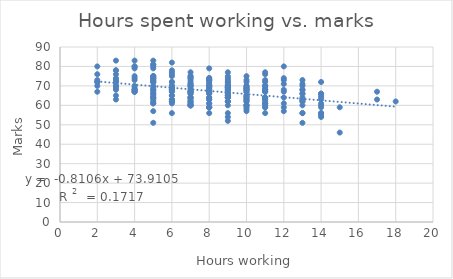
| Category | Mark |
|---|---|
| 9.0 | 64 |
| 4.0 | 74 |
| 13.0 | 73 |
| 9.0 | 65 |
| 8.0 | 72 |
| 8.0 | 63 |
| 7.0 | 66 |
| 7.0 | 60 |
| 9.0 | 69 |
| 9.0 | 73 |
| 8.0 | 73 |
| 7.0 | 71 |
| 9.0 | 60 |
| 10.0 | 73 |
| 14.0 | 61 |
| 2.0 | 72 |
| 6.0 | 72 |
| 8.0 | 74 |
| 9.0 | 56 |
| 14.0 | 72 |
| 17.0 | 67 |
| 9.0 | 69 |
| 11.0 | 56 |
| 10.0 | 69 |
| 11.0 | 61 |
| 3.0 | 74 |
| 13.0 | 63 |
| 7.0 | 60 |
| 14.0 | 63 |
| 10.0 | 64 |
| 11.0 | 64 |
| 5.0 | 73 |
| 3.0 | 63 |
| 11.0 | 72 |
| 10.0 | 67 |
| 5.0 | 64 |
| 11.0 | 77 |
| 6.0 | 69 |
| 4.0 | 70 |
| 7.0 | 75 |
| 11.0 | 70 |
| 13.0 | 70 |
| 7.0 | 64 |
| 14.0 | 65 |
| 8.0 | 70 |
| 10.0 | 58 |
| 9.0 | 64 |
| 9.0 | 64 |
| 7.0 | 73 |
| 5.0 | 61 |
| 11.0 | 73 |
| 13.0 | 71 |
| 6.0 | 65 |
| 11.0 | 63 |
| 10.0 | 62 |
| 12.0 | 80 |
| 7.0 | 60 |
| 6.0 | 76 |
| 11.0 | 63 |
| 7.0 | 67 |
| 11.0 | 61 |
| 3.0 | 73 |
| 7.0 | 60 |
| 6.0 | 65 |
| 6.0 | 62 |
| 8.0 | 70 |
| 12.0 | 74 |
| 6.0 | 82 |
| 5.0 | 67 |
| 9.0 | 62 |
| 2.0 | 80 |
| 3.0 | 78 |
| 11.0 | 64 |
| 11.0 | 68 |
| 5.0 | 81 |
| 8.0 | 66 |
| 11.0 | 70 |
| 13.0 | 63 |
| 7.0 | 75 |
| 10.0 | 63 |
| 8.0 | 59 |
| 7.0 | 77 |
| 4.0 | 69 |
| 3.0 | 72 |
| 5.0 | 68 |
| 11.0 | 70 |
| 6.0 | 77 |
| 9.0 | 65 |
| 5.0 | 66 |
| 10.0 | 64 |
| 7.0 | 62 |
| 11.0 | 64 |
| 10.0 | 57 |
| 6.0 | 62 |
| 9.0 | 62 |
| 6.0 | 63 |
| 8.0 | 67 |
| 5.0 | 68 |
| 10.0 | 65 |
| 3.0 | 65 |
| 5.0 | 72 |
| 14.0 | 55 |
| 9.0 | 64 |
| 12.0 | 57 |
| 5.0 | 66 |
| 5.0 | 75 |
| 5.0 | 83 |
| 4.0 | 68 |
| 6.0 | 68 |
| 6.0 | 69 |
| 14.0 | 66 |
| 3.0 | 69 |
| 12.0 | 71 |
| 10.0 | 68 |
| 8.0 | 68 |
| 9.0 | 64 |
| 8.0 | 64 |
| 10.0 | 75 |
| 11.0 | 68 |
| 5.0 | 70 |
| 6.0 | 70 |
| 3.0 | 76 |
| 5.0 | 63 |
| 3.0 | 78 |
| 9.0 | 70 |
| 9.0 | 69 |
| 13.0 | 62 |
| 5.0 | 73 |
| 4.0 | 67 |
| 2.0 | 67 |
| 4.0 | 75 |
| 10.0 | 60 |
| 13.0 | 62 |
| 8.0 | 67 |
| 11.0 | 59 |
| 4.0 | 80 |
| 7.0 | 61 |
| 6.0 | 72 |
| 5.0 | 51 |
| 14.0 | 60 |
| 5.0 | 65 |
| 2.0 | 73 |
| 7.0 | 74 |
| 6.0 | 62 |
| 5.0 | 74 |
| 8.0 | 71 |
| 9.0 | 66 |
| 14.0 | 64 |
| 8.0 | 69 |
| 11.0 | 67 |
| 12.0 | 59 |
| 7.0 | 70 |
| 9.0 | 69 |
| 5.0 | 64 |
| 9.0 | 66 |
| 8.0 | 59 |
| 11.0 | 61 |
| 13.0 | 56 |
| 13.0 | 66 |
| 10.0 | 69 |
| 9.0 | 72 |
| 9.0 | 52 |
| 5.0 | 74 |
| 7.0 | 70 |
| 7.0 | 64 |
| 11.0 | 62 |
| 4.0 | 68 |
| 4.0 | 68 |
| 13.0 | 66 |
| 8.0 | 59 |
| 10.0 | 67 |
| 10.0 | 70 |
| 7.0 | 68 |
| 8.0 | 79 |
| 8.0 | 61 |
| 9.0 | 68 |
| 9.0 | 69 |
| 4.0 | 67 |
| 8.0 | 73 |
| 9.0 | 70 |
| 9.0 | 72 |
| 7.0 | 74 |
| 5.0 | 75 |
| 10.0 | 68 |
| 8.0 | 64 |
| 9.0 | 54 |
| 4.0 | 79 |
| 10.0 | 63 |
| 11.0 | 76 |
| 6.0 | 68 |
| 9.0 | 67 |
| 8.0 | 73 |
| 5.0 | 64 |
| 13.0 | 68 |
| 12.0 | 73 |
| 12.0 | 68 |
| 8.0 | 69 |
| 3.0 | 72 |
| 4.0 | 83 |
| 8.0 | 59 |
| 9.0 | 67 |
| 17.0 | 63 |
| 9.0 | 71 |
| 9.0 | 74 |
| 6.0 | 63 |
| 5.0 | 81 |
| 7.0 | 64 |
| 9.0 | 64 |
| 6.0 | 78 |
| 9.0 | 75 |
| 5.0 | 80 |
| 8.0 | 70 |
| 7.0 | 69 |
| 12.0 | 67 |
| 9.0 | 77 |
| 9.0 | 70 |
| 13.0 | 64 |
| 3.0 | 83 |
| 6.0 | 68 |
| 6.0 | 61 |
| 5.0 | 79 |
| 7.0 | 66 |
| 6.0 | 67 |
| 10.0 | 60 |
| 14.0 | 66 |
| 7.0 | 70 |
| 6.0 | 68 |
| 7.0 | 62 |
| 8.0 | 70 |
| 10.0 | 65 |
| 14.0 | 56 |
| 18.0 | 62 |
| 2.0 | 76 |
| 3.0 | 70 |
| 5.0 | 75 |
| 10.0 | 68 |
| 10.0 | 60 |
| 10.0 | 70 |
| 4.0 | 67 |
| 8.0 | 68 |
| 5.0 | 62 |
| 3.0 | 70 |
| 6.0 | 70 |
| 8.0 | 67 |
| 11.0 | 67 |
| 3.0 | 68 |
| 8.0 | 56 |
| 7.0 | 61 |
| 8.0 | 66 |
| 9.0 | 62 |
| 5.0 | 69 |
| 14.0 | 54 |
| 12.0 | 64 |
| 5.0 | 72 |
| 2.0 | 70 |
| 6.0 | 56 |
| 4.0 | 80 |
| 11.0 | 59 |
| 6.0 | 75 |
| 7.0 | 63 |
| 11.0 | 60 |
| 5.0 | 57 |
| 8.0 | 74 |
| 13.0 | 68 |
| 2.0 | 72 |
| 6.0 | 68 |
| 15.0 | 59 |
| 11.0 | 67 |
| 9.0 | 68 |
| 13.0 | 51 |
| 9.0 | 70 |
| 8.0 | 61 |
| 12.0 | 61 |
| 7.0 | 72 |
| 8.0 | 73 |
| 10.0 | 62 |
| 9.0 | 65 |
| 10.0 | 69 |
| 5.0 | 61 |
| 7.0 | 71 |
| 4.0 | 73 |
| 8.0 | 67 |
| 11.0 | 69 |
| 6.0 | 69 |
| 7.0 | 67 |
| 14.0 | 56 |
| 7.0 | 67 |
| 15.0 | 46 |
| 10.0 | 59 |
| 5.0 | 74 |
| 13.0 | 56 |
| 11.0 | 68 |
| 14.0 | 59 |
| 13.0 | 60 |
| 10.0 | 72 |
| 6.0 | 67 |
| 7.0 | 67 |
| 9.0 | 68 |
| 8.0 | 63 |
| 5.0 | 72 |